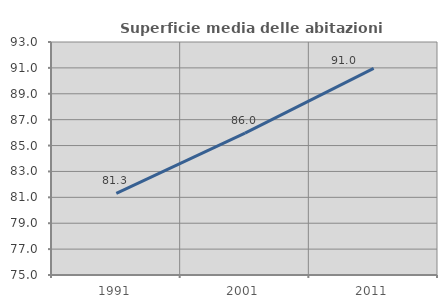
| Category | Superficie media delle abitazioni occupate |
|---|---|
| 1991.0 | 81.3 |
| 2001.0 | 85.956 |
| 2011.0 | 90.959 |